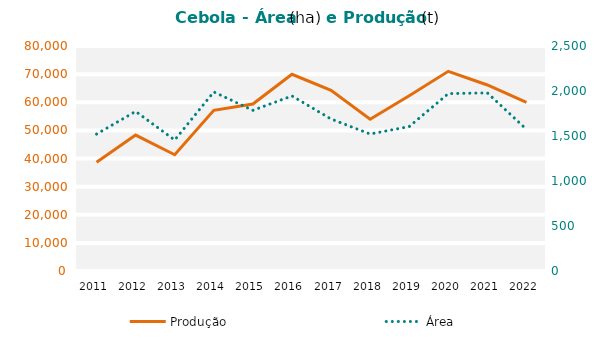
| Category | Produção |
|---|---|
| 2011.0 | 38692 |
| 2012.0 | 48316 |
| 2013.0 | 41336 |
| 2014.0 | 57134 |
| 2015.0 | 59374 |
| 2016.0 | 69929 |
| 2017.0 | 64247 |
| 2018.0 | 53977 |
| 2019.0 | 62302 |
| 2020.0 | 70993 |
| 2021.0 | 66148 |
| 2022.0 | 59967 |